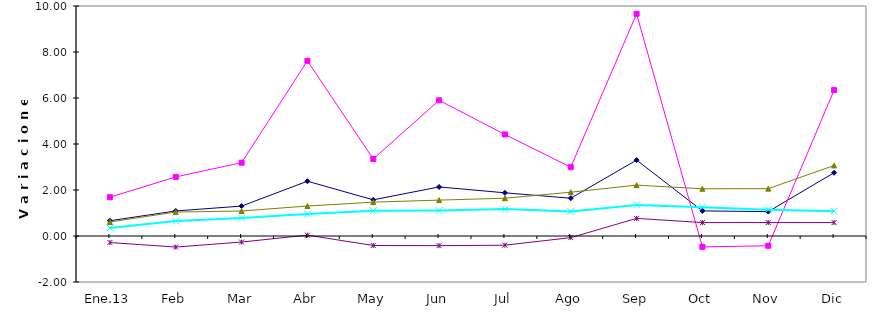
| Category | Series 0 | Series 1 | Series 2 | Series 3 | Series 4 |
|---|---|---|---|---|---|
| Ene.13 | 0.663 | 1.688 | 0.611 | 0.351 | -0.283 |
| Feb | 1.089 | 2.57 | 1.042 | 0.652 | -0.481 |
| Mar | 1.301 | 3.188 | 1.087 | 0.782 | -0.262 |
| Abr | 2.381 | 7.616 | 1.304 | 0.956 | 0.037 |
| May | 1.572 | 3.351 | 1.472 | 1.098 | -0.412 |
| Jun | 2.133 | 5.898 | 1.56 | 1.109 | -0.419 |
| Jul | 1.878 | 4.415 | 1.643 | 1.172 | -0.4 |
| Ago | 1.642 | 2.992 | 1.904 | 1.065 | -0.071 |
| Sep | 3.3 | 9.66 | 2.212 | 1.347 | 0.764 |
| Oct | 1.091 | -0.473 | 2.054 | 1.249 | 0.584 |
| Nov | 1.06 | -0.425 | 2.058 | 1.146 | 0.584 |
| Dic | 2.752 | 6.343 | 3.066 | 1.081 | 0.584 |